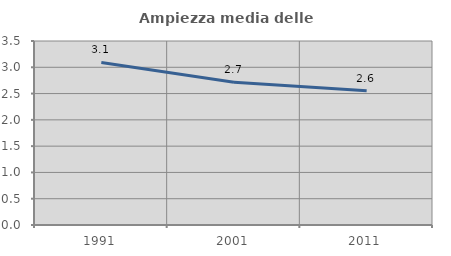
| Category | Ampiezza media delle famiglie |
|---|---|
| 1991.0 | 3.092 |
| 2001.0 | 2.715 |
| 2011.0 | 2.556 |